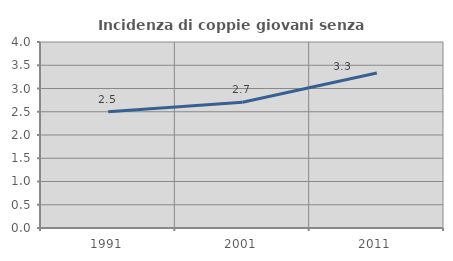
| Category | Incidenza di coppie giovani senza figli |
|---|---|
| 1991.0 | 2.5 |
| 2001.0 | 2.703 |
| 2011.0 | 3.333 |